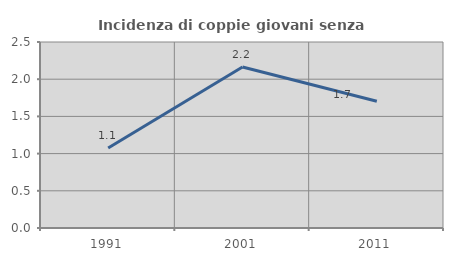
| Category | Incidenza di coppie giovani senza figli |
|---|---|
| 1991.0 | 1.075 |
| 2001.0 | 2.163 |
| 2011.0 | 1.705 |